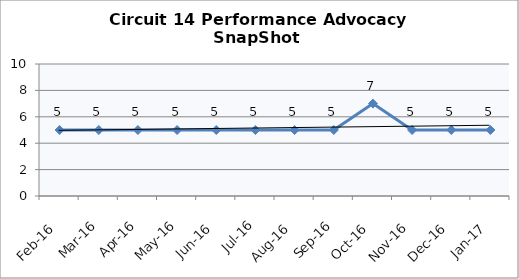
| Category | Circuit 14 |
|---|---|
| Feb-16 | 5 |
| Mar-16 | 5 |
| Apr-16 | 5 |
| May-16 | 5 |
| Jun-16 | 5 |
| Jul-16 | 5 |
| Aug-16 | 5 |
| Sep-16 | 5 |
| Oct-16 | 7 |
| Nov-16 | 5 |
| Dec-16 | 5 |
| Jan-17 | 5 |